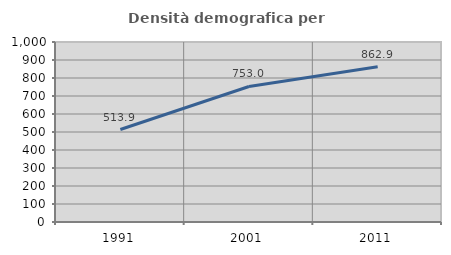
| Category | Densità demografica |
|---|---|
| 1991.0 | 513.884 |
| 2001.0 | 752.989 |
| 2011.0 | 862.9 |